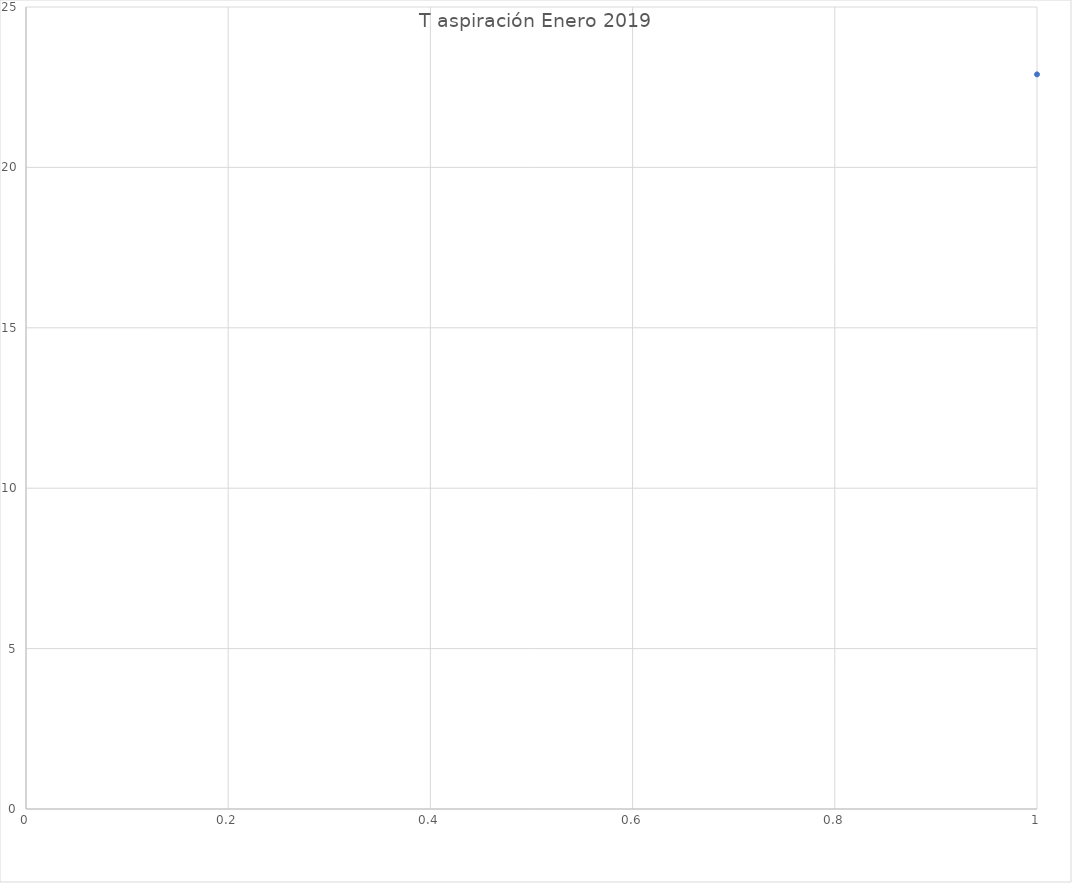
| Category | Series 0 |
|---|---|
| 0 | 22.9 |
| 1 | 22.9 |
| 2 | 22.9 |
| 3 | 22.9 |
| 4 | 22.9 |
| 5 | 22.9 |
| 6 | 22.9 |
| 7 | 22.9 |
| 8 | 22.9 |
| 9 | 22.9 |
| 10 | 22.9 |
| 11 | 22.9 |
| 12 | 22.9 |
| 13 | 22.9 |
| 14 | 22.9 |
| 15 | 22.9 |
| 16 | 22.9 |
| 17 | 22.9 |
| 18 | 22.9 |
| 19 | 22.9 |
| 20 | 22.9 |
| 21 | 22.9 |
| 22 | 22.9 |
| 23 | 22.9 |
| 24 | 22.9 |
| 25 | 22.9 |
| 26 | 22.9 |
| 27 | 22.9 |
| 28 | 22.9 |
| 29 | 22.9 |
| 30 | 22.9 |
| 31 | 22.9 |
| 32 | 22.9 |
| 33 | 22.9 |
| 34 | 22.9 |
| 35 | 22.9 |
| 36 | 22.9 |
| 37 | 22.8 |
| 38 | 22.8 |
| 39 | 22.8 |
| 40 | 22.8 |
| 41 | 22.8 |
| 42 | 22.8 |
| 43 | 22.8 |
| 44 | 22.8 |
| 45 | 22.8 |
| 46 | 22.8 |
| 47 | 22.8 |
| 48 | 22.8 |
| 49 | 22.8 |
| 50 | 22.8 |
| 51 | 22.8 |
| 52 | 22.8 |
| 53 | 22.8 |
| 54 | 22.8 |
| 55 | 22.8 |
| 56 | 22.8 |
| 57 | 22.8 |
| 58 | 22.8 |
| 59 | 22.8 |
| 60 | 22.8 |
| 61 | 22.8 |
| 62 | 22.8 |
| 63 | 22.8 |
| 64 | 22.8 |
| 65 | 22.8 |
| 66 | 22.8 |
| 67 | 22.8 |
| 68 | 22.8 |
| 69 | 22.8 |
| 70 | 22.8 |
| 71 | 22.8 |
| 72 | 22.8 |
| 73 | 22.8 |
| 74 | 22.8 |
| 75 | 22.8 |
| 76 | 22.8 |
| 77 | 22.8 |
| 78 | 22.8 |
| 79 | 22.8 |
| 80 | 22.8 |
| 81 | 22.8 |
| 82 | 22.8 |
| 83 | 22.8 |
| 84 | 22.8 |
| 85 | 22.8 |
| 86 | 22.8 |
| 87 | 22.8 |
| 88 | 22.8 |
| 89 | 22.8 |
| 90 | 22.7 |
| 91 | 22.8 |
| 92 | 22.7 |
| 93 | 22.7 |
| 94 | 22.8 |
| 95 | 22.7 |
| 96 | 22.7 |
| 97 | 22.7 |
| 98 | 22.7 |
| 99 | 22.7 |
| 100 | 22.8 |
| 101 | 22.7 |
| 102 | 22.7 |
| 103 | 22.7 |
| 104 | 22.7 |
| 105 | 22.7 |
| 106 | 22.7 |
| 107 | 22.7 |
| 108 | 22.7 |
| 109 | 22.7 |
| 110 | 22.7 |
| 111 | 22.7 |
| 112 | 22.7 |
| 113 | 22.7 |
| 114 | 22.7 |
| 115 | 22.7 |
| 116 | 22.7 |
| 117 | 22.7 |
| 118 | 22.8 |
| 119 | 22.7 |
| 120 | 22.8 |
| 121 | 22.8 |
| 122 | 22.7 |
| 123 | 22.8 |
| 124 | 22.7 |
| 125 | 22.7 |
| 126 | 22.7 |
| 127 | 22.7 |
| 128 | 22.8 |
| 129 | 22.8 |
| 130 | 22.8 |
| 131 | 22.7 |
| 132 | 22.7 |
| 133 | 22.7 |
| 134 | 22.8 |
| 135 | 22.7 |
| 136 | 22.7 |
| 137 | 22.7 |
| 138 | 22.7 |
| 139 | 22.7 |
| 140 | 22.7 |
| 141 | 22.7 |
| 142 | 22.7 |
| 143 | 22.7 |
| 144 | 22.7 |
| 145 | 22.7 |
| 146 | 22.7 |
| 147 | 22.7 |
| 148 | 22.7 |
| 149 | 22.8 |
| 150 | 22.9 |
| 151 | 22.9 |
| 152 | 23 |
| 153 | 23 |
| 154 | 23 |
| 155 | 23 |
| 156 | 23 |
| 157 | 23 |
| 158 | 23 |
| 159 | 22.9 |
| 160 | 22.9 |
| 161 | 22.9 |
| 162 | 22.8 |
| 163 | 22.8 |
| 164 | 22.8 |
| 165 | 22.7 |
| 166 | 22.7 |
| 167 | 22.6 |
| 168 | 22.6 |
| 169 | 22.5 |
| 170 | 22.5 |
| 171 | 22.4 |
| 172 | 22.4 |
| 173 | 22.3 |
| 174 | 22.3 |
| 175 | 22.2 |
| 176 | 22.2 |
| 177 | 22.1 |
| 178 | 22.1 |
| 179 | 22 |
| 180 | 22 |
| 181 | 21.9 |
| 182 | 21.8 |
| 183 | 21.8 |
| 184 | 21.7 |
| 185 | 21.6 |
| 186 | 21.6 |
| 187 | 21.5 |
| 188 | 21.5 |
| 189 | 21.4 |
| 190 | 21.3 |
| 191 | 21.2 |
| 192 | 21.2 |
| 193 | 21.1 |
| 194 | 21 |
| 195 | 20.9 |
| 196 | 20.8 |
| 197 | 20.7 |
| 198 | 20.6 |
| 199 | 20.5 |
| 200 | 20.4 |
| 201 | 20.3 |
| 202 | 20.2 |
| 203 | 20.1 |
| 204 | 20 |
| 205 | 19.9 |
| 206 | 19.8 |
| 207 | 19.7 |
| 208 | 19.6 |
| 209 | 19.5 |
| 210 | 19.4 |
| 211 | 19.3 |
| 212 | 19.2 |
| 213 | 19.2 |
| 214 | 19.1 |
| 215 | 19.2 |
| 216 | 19.1 |
| 217 | 19.7 |
| 218 | 20.6 |
| 219 | 21 |
| 220 | 21.3 |
| 221 | 23.1 |
| 222 | 23.1 |
| 223 | 23 |
| 224 | 22.9 |
| 225 | 22.9 |
| 226 | 22.9 |
| 227 | 22.8 |
| 228 | 22.8 |
| 229 | 22.7 |
| 230 | 22.8 |
| 231 | 22.8 |
| 232 | 22.8 |
| 233 | 22.8 |
| 234 | 22.8 |
| 235 | 22.8 |
| 236 | 22.8 |
| 237 | 22.8 |
| 238 | 22.8 |
| 239 | 22.8 |
| 240 | 22.8 |
| 241 | 22.8 |
| 242 | 22.8 |
| 243 | 22.8 |
| 244 | 22.8 |
| 245 | 22.9 |
| 246 | 22.9 |
| 247 | 22.9 |
| 248 | 22.9 |
| 249 | 22.8 |
| 250 | 22.8 |
| 251 | 22.8 |
| 252 | 22.8 |
| 253 | 22.8 |
| 254 | 22.8 |
| 255 | 22.8 |
| 256 | 22.7 |
| 257 | 22.7 |
| 258 | 22.7 |
| 259 | 22.6 |
| 260 | 22.6 |
| 261 | 22.6 |
| 262 | 22.5 |
| 263 | 22.5 |
| 264 | 22.5 |
| 265 | 22.4 |
| 266 | 22.4 |
| 267 | 22.3 |
| 268 | 22.3 |
| 269 | 22.2 |
| 270 | 22.2 |
| 271 | 22.1 |
| 272 | 22.1 |
| 273 | 22 |
| 274 | 21.9 |
| 275 | 21.9 |
| 276 | 21.8 |
| 277 | 21.8 |
| 278 | 21.7 |
| 279 | 21.6 |
| 280 | 21.6 |
| 281 | 21.5 |
| 282 | 21.5 |
| 283 | 21.4 |
| 284 | 21.4 |
| 285 | 21.3 |
| 286 | 21.2 |
| 287 | 21.2 |
| 288 | 21.1 |
| 289 | 21.1 |
| 290 | 21 |
| 291 | 20.9 |
| 292 | 20.9 |
| 293 | 20.8 |
| 294 | 20.7 |
| 295 | 20.7 |
| 296 | 20.6 |
| 297 | 20.5 |
| 298 | 20.5 |
| 299 | 20.4 |
| 300 | 20.3 |
| 301 | 20.3 |
| 302 | 20.2 |
| 303 | 20.2 |
| 304 | 20.1 |
| 305 | 20 |
| 306 | 20 |
| 307 | 19.9 |
| 308 | 19.8 |
| 309 | 19.8 |
| 310 | 19.7 |
| 311 | 19.6 |
| 312 | 19.6 |
| 313 | 19.5 |
| 314 | 19.5 |
| 315 | 19.5 |
| 316 | 19.4 |
| 317 | 19.3 |
| 318 | 23.1 |
| 319 | 23.1 |
| 320 | 23 |
| 321 | 23 |
| 322 | 22.9 |
| 323 | 22.9 |
| 324 | 22.9 |
| 325 | 22.9 |
| 326 | 22.9 |
| 327 | 22.9 |
| 328 | 22.9 |
| 329 | 22.8 |
| 330 | 22.8 |
| 331 | 22.8 |
| 332 | 22.8 |
| 333 | 22.8 |
| 334 | 22.8 |
| 335 | 22.8 |
| 336 | 22.8 |
| 337 | 22.8 |
| 338 | 22.8 |
| 339 | 22.8 |
| 340 | 22.8 |
| 341 | 22.8 |
| 342 | 22.8 |
| 343 | 22.8 |
| 344 | 22.8 |
| 345 | 22.8 |
| 346 | 22.7 |
| 347 | 22.7 |
| 348 | 22.7 |
| 349 | 22.6 |
| 350 | 22.6 |
| 351 | 22.5 |
| 352 | 22.5 |
| 353 | 22.5 |
| 354 | 22.4 |
| 355 | 22.4 |
| 356 | 22.3 |
| 357 | 22.3 |
| 358 | 22.2 |
| 359 | 22.2 |
| 360 | 22.1 |
| 361 | 22.1 |
| 362 | 22 |
| 363 | 22 |
| 364 | 21.9 |
| 365 | 21.8 |
| 366 | 21.8 |
| 367 | 21.7 |
| 368 | 21.7 |
| 369 | 21.6 |
| 370 | 21.6 |
| 371 | 21.5 |
| 372 | 21.4 |
| 373 | 21.4 |
| 374 | 21.3 |
| 375 | 21.2 |
| 376 | 21.2 |
| 377 | 21.1 |
| 378 | 21 |
| 379 | 21 |
| 380 | 20.9 |
| 381 | 20.8 |
| 382 | 20.8 |
| 383 | 20.7 |
| 384 | 20.7 |
| 385 | 20.6 |
| 386 | 20.5 |
| 387 | 20.5 |
| 388 | 20.4 |
| 389 | 20.3 |
| 390 | 20.3 |
| 391 | 20.2 |
| 392 | 20.2 |
| 393 | 20.1 |
| 394 | 20 |
| 395 | 20 |
| 396 | 19.9 |
| 397 | 19.8 |
| 398 | 19.8 |
| 399 | 19.7 |
| 400 | 19.7 |
| 401 | 19.6 |
| 402 | 19.5 |
| 403 | 19.4 |
| 404 | 19.4 |
| 405 | 19.3 |
| 406 | 19.2 |
| 407 | 19.2 |
| 408 | 19.1 |
| 409 | 19 |
| 410 | 18.9 |
| 411 | 18.9 |
| 412 | 22.9 |
| 413 | 23.1 |